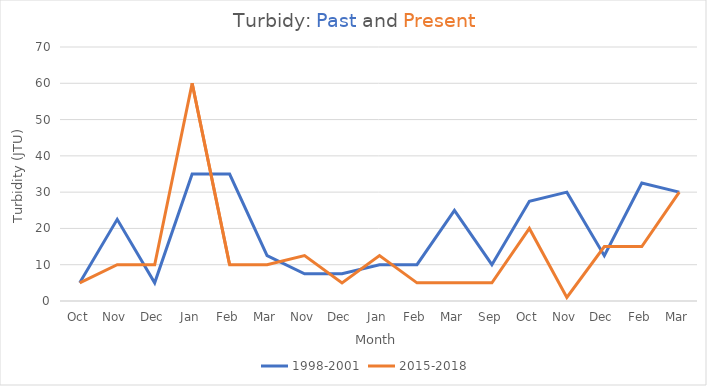
| Category | 1998-2001 | 2015-2018 |
|---|---|---|
| Oct | 5 | 5 |
| Nov | 22.5 | 10 |
| Dec | 5 | 10 |
| Jan | 35 | 60 |
| Feb | 35 | 10 |
| Mar | 12.5 | 10 |
| Nov | 7.5 | 12.5 |
| Dec | 7.5 | 5 |
| Jan | 10 | 12.5 |
| Feb | 10 | 5 |
| Mar | 25 | 5 |
| Sep | 10 | 5 |
| Oct | 27.5 | 20 |
| Nov | 30 | 1 |
| Dec | 12.5 | 15 |
| Feb | 32.5 | 15 |
| Mar | 30 | 30 |